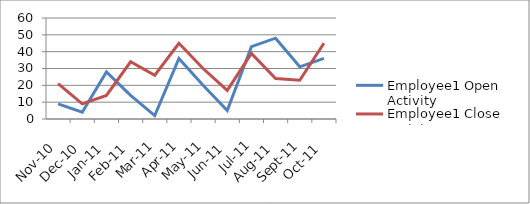
| Category | Employee1 Open Activity | Employee1 Close Activity |
|---|---|---|
| 2010-11-01 | 9 | 21 |
| 2010-12-01 | 4 | 9 |
| 2011-01-01 | 28 | 14 |
| 2011-02-01 | 14 | 34 |
| 2011-03-01 | 2 | 26 |
| 2011-04-01 | 36 | 45 |
| 2011-05-01 | 20 | 30 |
| 2011-06-01 | 5 | 17 |
| 2011-07-01 | 43 | 39 |
| 2011-08-01 | 48 | 24 |
| 2011-09-01 | 31 | 23 |
| 2011-10-01 | 36 | 45 |